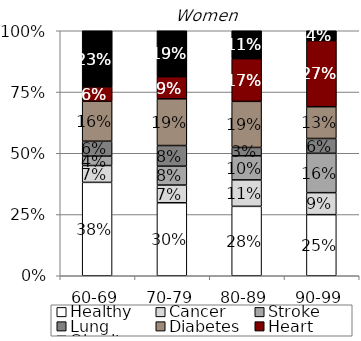
| Category | Healthy | Cancer | Stroke | Lung | Diabetes | Heart | Obesity |
|---|---|---|---|---|---|---|---|
| 60-69 | 0.381 | 0.069 | 0.038 | 0.061 | 0.163 | 0.059 | 0.229 |
| 70-79 | 0.298 | 0.072 | 0.077 | 0.084 | 0.191 | 0.09 | 0.187 |
| 80-89 | 0.283 | 0.108 | 0.098 | 0.034 | 0.188 | 0.174 | 0.114 |
| 90-99 | 0.249 | 0.09 | 0.161 | 0.061 | 0.13 | 0.27 | 0.04 |